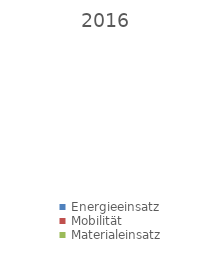
| Category | 2016 |
|---|---|
| Energieeinsatz | 0 |
| Mobilität | 0 |
| Materialeinsatz | 0 |